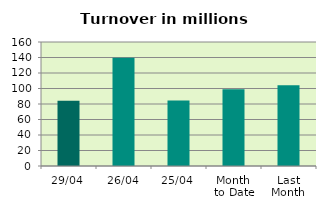
| Category | Series 0 |
|---|---|
| 29/04 | 84.049 |
| 26/04 | 139.625 |
| 25/04 | 84.367 |
| Month 
to Date | 99.07 |
| Last
Month | 104.085 |